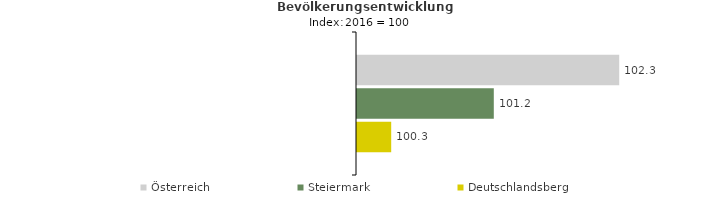
| Category | Österreich | Steiermark | Deutschlandsberg |
|---|---|---|---|
| 2020.0 | 102.3 | 101.2 | 100.3 |